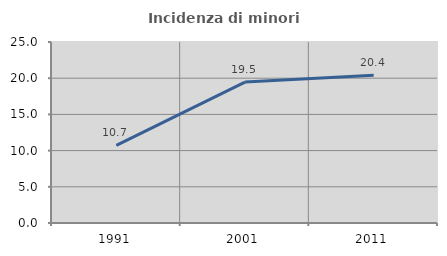
| Category | Incidenza di minori stranieri |
|---|---|
| 1991.0 | 10.714 |
| 2001.0 | 19.469 |
| 2011.0 | 20.408 |